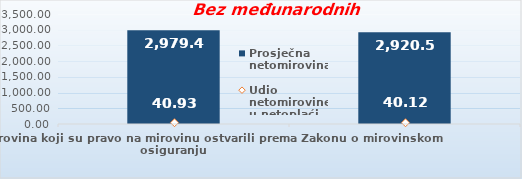
| Category | Prosječna netomirovina  |
|---|---|
| Korisnici mirovina koji su pravo na mirovinu ostvarili prema Zakonu o mirovinskom osiguranju  | 2979.47 |
| Korisnici koji su pravo na mirovinu PRVI PUT ostvarili u 2022. godini prema Zakonu o mirovinskom osiguranju - NOVI KORISNICI | 2920.583 |